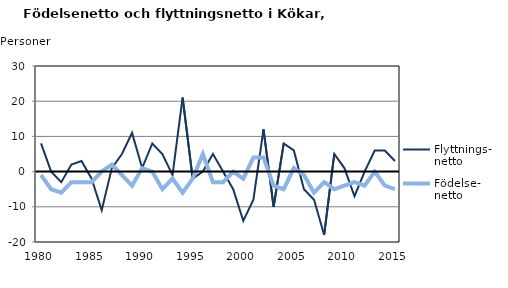
| Category | Flyttnings- netto | Födelse- netto |
|---|---|---|
| 1980.0 | 8 | -1 |
| 1981.0 | 0 | -5 |
| 1982.0 | -3 | -6 |
| 1983.0 | 2 | -3 |
| 1984.0 | 3 | -3 |
| 1985.0 | -2 | -3 |
| 1986.0 | -11 | 0 |
| 1987.0 | 1 | 2 |
| 1988.0 | 5 | -1 |
| 1989.0 | 11 | -4 |
| 1990.0 | 1 | 1 |
| 1991.0 | 8 | 0 |
| 1992.0 | 5 | -5 |
| 1993.0 | -1 | -2 |
| 1994.0 | 21 | -6 |
| 1995.0 | -2 | -2 |
| 1996.0 | 0 | 5 |
| 1997.0 | 5 | -3 |
| 1998.0 | 0 | -3 |
| 1999.0 | -5 | 0 |
| 2000.0 | -14 | -2 |
| 2001.0 | -8 | 4 |
| 2002.0 | 12 | 4 |
| 2003.0 | -10 | -4 |
| 2004.0 | 8 | -5 |
| 2005.0 | 6 | 1 |
| 2006.0 | -5 | -1 |
| 2007.0 | -8 | -6 |
| 2008.0 | -18 | -3 |
| 2009.0 | 5 | -5 |
| 2010.0 | 1 | -4 |
| 2011.0 | -7 | -3 |
| 2012.0 | 0 | -4 |
| 2013.0 | 6 | 0 |
| 2014.0 | 6 | -4 |
| 2015.0 | 3 | -5 |